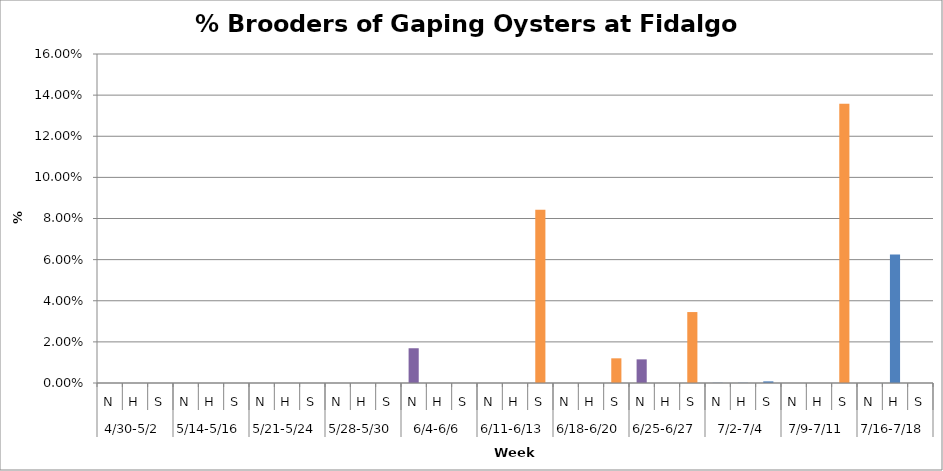
| Category | % Brooders |
|---|---|
| 0 | 0 |
| 1 | 0 |
| 2 | 0 |
| 3 | 0 |
| 4 | 0 |
| 5 | 0 |
| 6 | 0 |
| 7 | 0 |
| 8 | 0 |
| 9 | 0 |
| 10 | 0 |
| 11 | 0 |
| 12 | 0.017 |
| 13 | 0 |
| 14 | 0 |
| 15 | 0 |
| 16 | 0 |
| 17 | 0.084 |
| 18 | 0 |
| 19 | 0 |
| 20 | 0.012 |
| 21 | 0.012 |
| 22 | 0 |
| 23 | 0.034 |
| 24 | 0 |
| 25 | 0 |
| 26 | 0.001 |
| 27 | 0 |
| 28 | 0 |
| 29 | 0.136 |
| 30 | 0 |
| 31 | 0.062 |
| 32 | 0 |